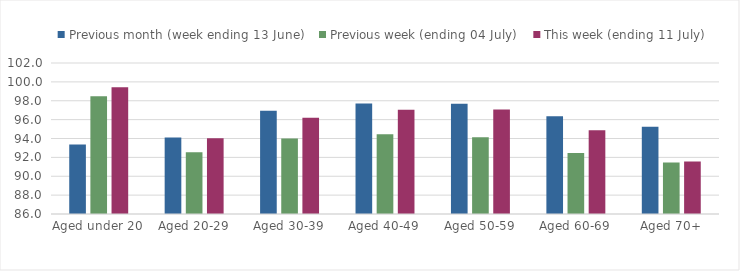
| Category | Previous month (week ending 13 June) | Previous week (ending 04 July) | This week (ending 11 July) |
|---|---|---|---|
| Aged under 20 | 93.361 | 98.477 | 99.425 |
| Aged 20-29 | 94.118 | 92.546 | 94.024 |
| Aged 30-39 | 96.93 | 94.007 | 96.205 |
| Aged 40-49 | 97.71 | 94.455 | 97.038 |
| Aged 50-59 | 97.688 | 94.131 | 97.078 |
| Aged 60-69 | 96.353 | 92.475 | 94.878 |
| Aged 70+ | 95.254 | 91.449 | 91.569 |